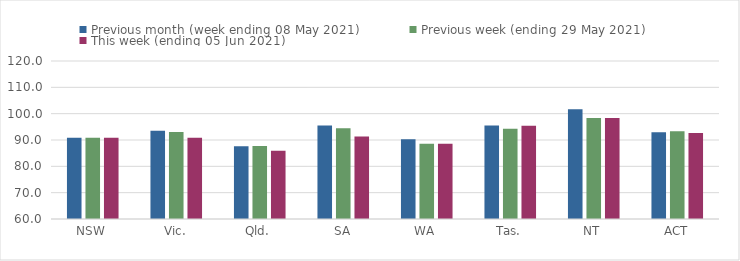
| Category | Previous month (week ending 08 May 2021) | Previous week (ending 29 May 2021) | This week (ending 05 Jun 2021) |
|---|---|---|---|
| NSW | 90.89 | 90.88 | 90.88 |
| Vic. | 93.53 | 93 | 90.83 |
| Qld. | 87.64 | 87.71 | 85.95 |
| SA | 95.51 | 94.48 | 91.34 |
| WA | 90.31 | 88.59 | 88.59 |
| Tas. | 95.49 | 94.27 | 95.4 |
| NT | 101.66 | 98.34 | 98.34 |
| ACT | 92.91 | 93.35 | 92.68 |